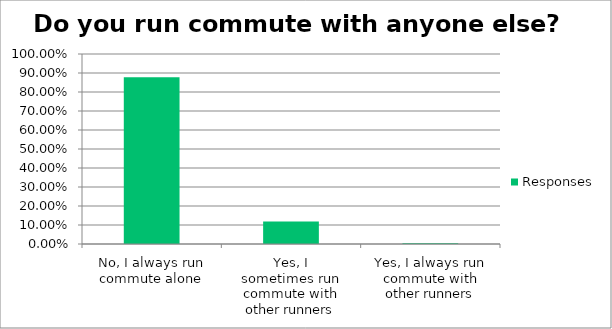
| Category | Responses |
|---|---|
| No, I always run commute alone | 0.878 |
| Yes, I sometimes run commute with other runners | 0.118 |
| Yes, I always run commute with other runners | 0.004 |